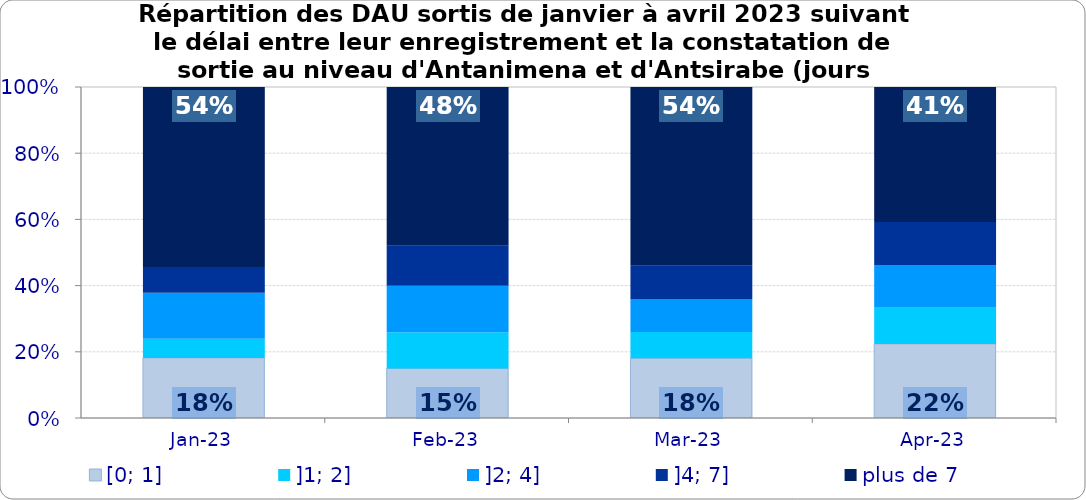
| Category | [0; 1] | ]1; 2] | ]2; 4] | ]4; 7] | plus de 7 |
|---|---|---|---|---|---|
| 2023-01-01 | 0.182 | 0.058 | 0.138 | 0.078 | 0.544 |
| 2023-02-01 | 0.15 | 0.11 | 0.141 | 0.121 | 0.479 |
| 2023-03-01 | 0.18 | 0.079 | 0.099 | 0.102 | 0.54 |
| 2023-04-01 | 0.224 | 0.112 | 0.127 | 0.131 | 0.408 |